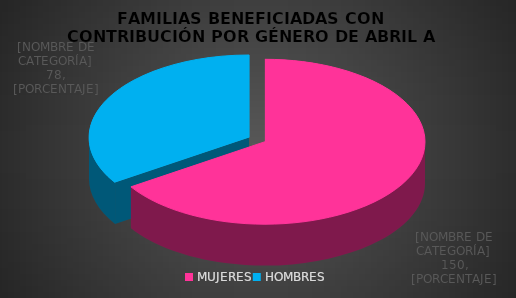
| Category | NUMERO DE FAMILIAS |
|---|---|
| MUJERES | 150 |
| HOMBRES | 78 |